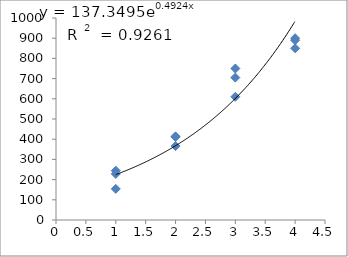
| Category | Series 0 |
|---|---|
| 1.0 | 228 |
| 1.0 | 244 |
| 1.0 | 154 |
| 2.0 | 411 |
| 2.0 | 366 |
| 2.0 | 414 |
| 3.0 | 705 |
| 3.0 | 750 |
| 3.0 | 610 |
| 4.0 | 900 |
| 4.0 | 890 |
| 4.0 | 850 |